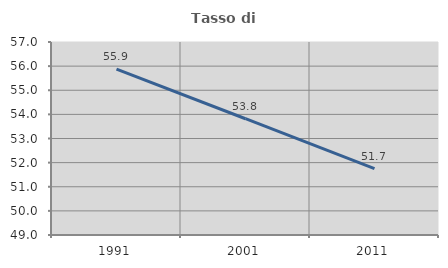
| Category | Tasso di occupazione   |
|---|---|
| 1991.0 | 55.872 |
| 2001.0 | 53.82 |
| 2011.0 | 51.749 |